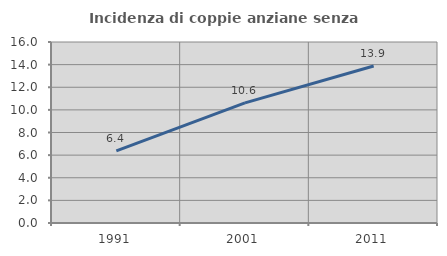
| Category | Incidenza di coppie anziane senza figli  |
|---|---|
| 1991.0 | 6.367 |
| 2001.0 | 10.622 |
| 2011.0 | 13.88 |